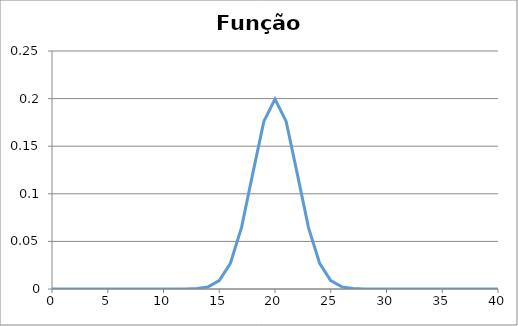
| Category | Series 0 |
|---|---|
| 0.0 | 0 |
| 1.0 | 0 |
| 2.0 | 0 |
| 3.0 | 0 |
| 4.0 | 0 |
| 5.0 | 0 |
| 6.0 | 0 |
| 7.0 | 0 |
| 8.0 | 0 |
| 9.0 | 0 |
| 10.0 | 0 |
| 11.0 | 0 |
| 12.0 | 0 |
| 13.0 | 0 |
| 14.0 | 0.002 |
| 15.0 | 0.009 |
| 16.0 | 0.027 |
| 17.0 | 0.065 |
| 18.0 | 0.121 |
| 19.0 | 0.176 |
| 20.0 | 0.199 |
| 21.0 | 0.176 |
| 22.0 | 0.121 |
| 23.0 | 0.065 |
| 24.0 | 0.027 |
| 25.0 | 0.009 |
| 26.0 | 0.002 |
| 27.0 | 0 |
| 28.0 | 0 |
| 29.0 | 0 |
| 30.0 | 0 |
| 31.0 | 0 |
| 32.0 | 0 |
| 33.0 | 0 |
| 34.0 | 0 |
| 35.0 | 0 |
| 36.0 | 0 |
| 37.0 | 0 |
| 38.0 | 0 |
| 39.0 | 0 |
| 40.0 | 0 |